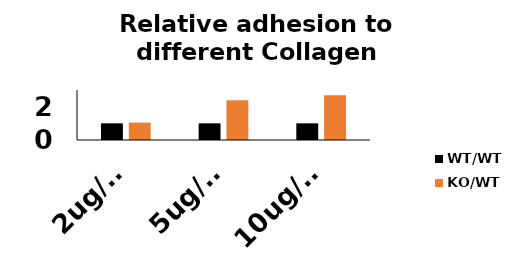
| Category | WT/WT | KO/WT |
|---|---|---|
| 2ug/ml | 1 | 1.046 |
| 5ug/ml | 1 | 2.384 |
| 10ug/ml | 1 | 2.687 |